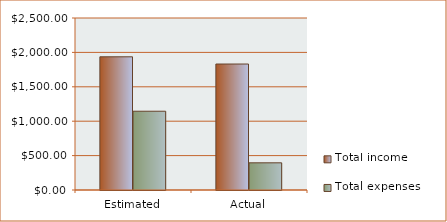
| Category | Total income | Total expenses |
|---|---|---|
| Estimated | 1936 | 1145 |
| Actual | 1831 | 395 |